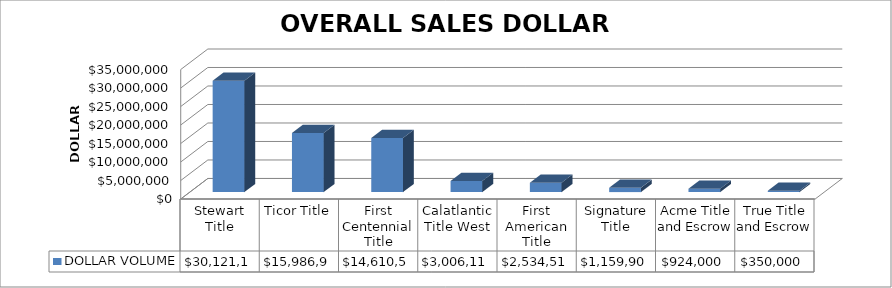
| Category | DOLLAR VOLUME |
|---|---|
| Stewart Title | 30121120 |
| Ticor Title | 15986911 |
| First Centennial Title | 14610587 |
| Calatlantic Title West | 3006113 |
| First American Title | 2534518 |
| Signature Title | 1159900 |
| Acme Title and Escrow | 924000 |
| True Title and Escrow | 350000 |